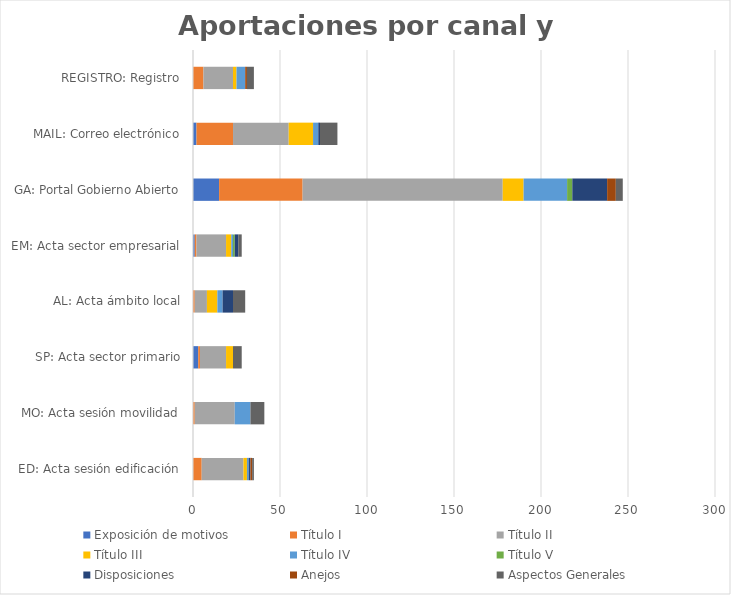
| Category | Exposición de motivos | Título I | Título II | Título III | Título IV | Título V | Disposiciones | Anejos | Aspectos Generales |
|---|---|---|---|---|---|---|---|---|---|
| ED: Acta sesión edificación | 0 | 5 | 24 | 2 | 1 | 0 | 1 | 1 | 1 |
| MO: Acta sesión movilidad | 0 | 1 | 23 | 0 | 9 | 0 | 0 | 0 | 8 |
| SP: Acta sector primario | 3 | 1 | 15 | 4 | 0 | 0 | 0 | 0 | 5 |
| AL: Acta ámbito local | 0 | 1 | 7 | 6 | 3 | 0 | 6 | 0 | 7 |
| EM: Acta sector empresarial | 1 | 1 | 17 | 3 | 1 | 1 | 2 | 0 | 2 |
| GA: Portal Gobierno Abierto | 15 | 48 | 115 | 12 | 25 | 3 | 20 | 5 | 4 |
| MAIL: Correo electrónico | 2 | 21 | 32 | 14 | 3 | 0 | 1 | 0 | 10 |
| REGISTRO: Registro | 0 | 6 | 17 | 2 | 5 | 0 | 0 | 1 | 4 |